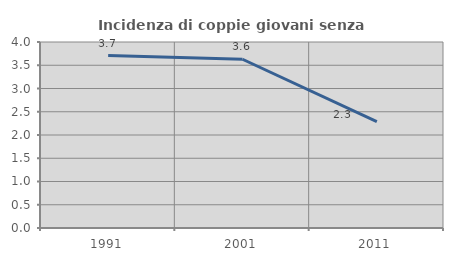
| Category | Incidenza di coppie giovani senza figli |
|---|---|
| 1991.0 | 3.708 |
| 2001.0 | 3.629 |
| 2011.0 | 2.287 |